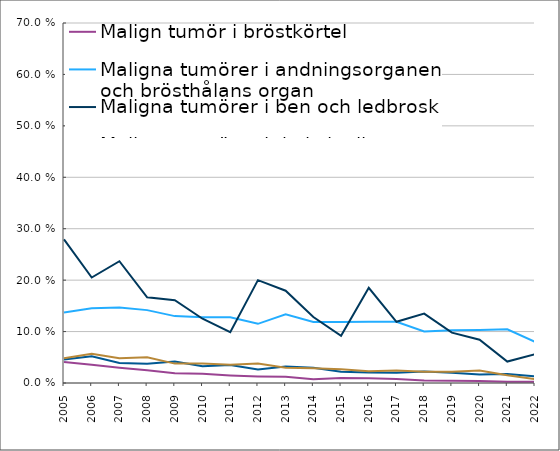
| Category | Malign tumör i bröstkörtel | Maligna tumörer i andningsorganen och brösthålans organ | Maligna tumörer i ben och ledbrosk | Maligna tumörer i de kvinnliga könsorganen | Maligna tumörer i de manliga könsorganen |
|---|---|---|---|---|---|
| 2005.0 | 0.041 | 0.137 | 0.279 | 0.045 | 0.048 |
| 2006.0 | 0.036 | 0.145 | 0.205 | 0.052 | 0.057 |
| 2007.0 | 0.03 | 0.147 | 0.237 | 0.039 | 0.048 |
| 2008.0 | 0.025 | 0.142 | 0.167 | 0.037 | 0.05 |
| 2009.0 | 0.019 | 0.13 | 0.161 | 0.042 | 0.038 |
| 2010.0 | 0.018 | 0.128 | 0.125 | 0.032 | 0.038 |
| 2011.0 | 0.015 | 0.128 | 0.099 | 0.035 | 0.036 |
| 2012.0 | 0.013 | 0.115 | 0.2 | 0.026 | 0.038 |
| 2013.0 | 0.012 | 0.134 | 0.179 | 0.032 | 0.03 |
| 2014.0 | 0.007 | 0.119 | 0.128 | 0.03 | 0.029 |
| 2015.0 | 0.009 | 0.119 | 0.092 | 0.022 | 0.027 |
| 2016.0 | 0.009 | 0.119 | 0.185 | 0.02 | 0.023 |
| 2017.0 | 0.008 | 0.119 | 0.119 | 0.02 | 0.025 |
| 2018.0 | 0.005 | 0.1 | 0.135 | 0.022 | 0.022 |
| 2019.0 | 0.004 | 0.103 | 0.098 | 0.02 | 0.022 |
| 2020.0 | 0.004 | 0.103 | 0.084 | 0.016 | 0.024 |
| 2021.0 | 0.002 | 0.104 | 0.042 | 0.017 | 0.015 |
| 2022.0 | 0.002 | 0.08 | 0.056 | 0.013 | 0.007 |